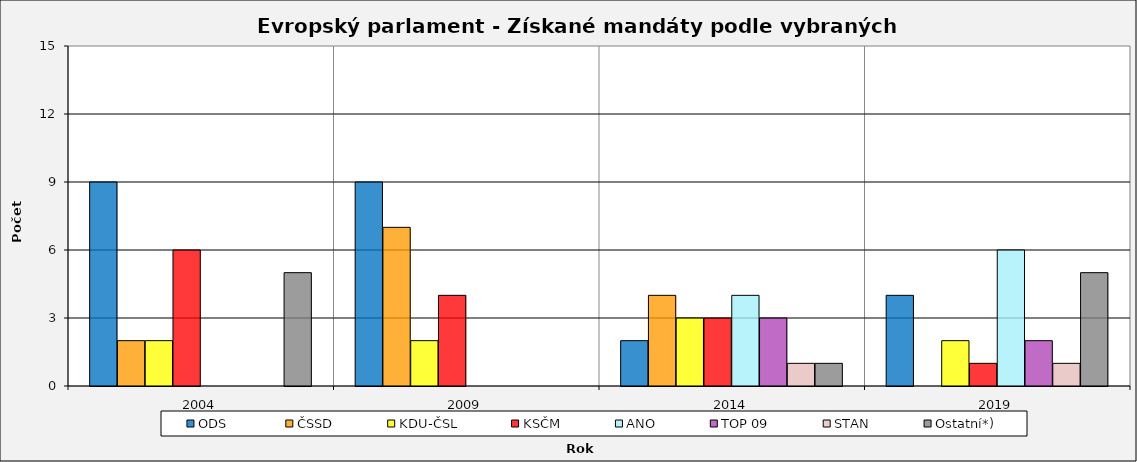
| Category | ODS  | ČSSD | KDU-ČSL | KSČM | ANO | TOP 09 | STAN | Ostatní*) |
|---|---|---|---|---|---|---|---|---|
| 2004.0 | 9 | 2 | 2 | 6 | 0 | 0 | 0 | 5 |
| 2009.0 | 9 | 7 | 2 | 4 | 0 | 0 | 0 | 0 |
| 2014.0 | 2 | 4 | 3 | 3 | 4 | 3 | 1 | 1 |
| 2019.0 | 4 | 0 | 2 | 1 | 6 | 2 | 1 | 5 |